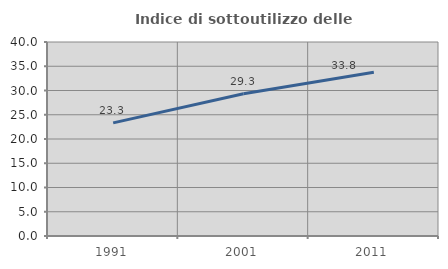
| Category | Indice di sottoutilizzo delle abitazioni  |
|---|---|
| 1991.0 | 23.324 |
| 2001.0 | 29.344 |
| 2011.0 | 33.753 |